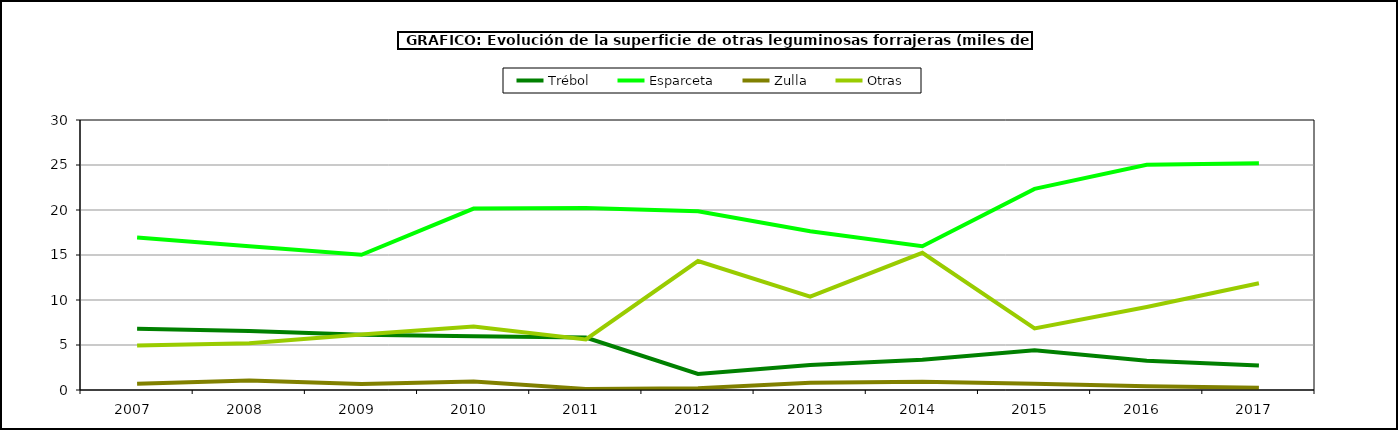
| Category | Trébol | Esparceta | Zulla | Otras |
|---|---|---|---|---|
| 2007.0 | 6.792 | 16.94 | 0.703 | 4.949 |
| 2008.0 | 6.551 | 15.979 | 1.06 | 5.192 |
| 2009.0 | 6.149 | 15.028 | 0.667 | 6.159 |
| 2010.0 | 5.977 | 20.154 | 0.957 | 7.056 |
| 2011.0 | 5.836 | 20.216 | 0.117 | 5.61 |
| 2012.0 | 1.782 | 19.86 | 0.202 | 14.331 |
| 2013.0 | 2.77 | 17.645 | 0.8 | 10.366 |
| 2014.0 | 3.361 | 15.981 | 0.92 | 15.244 |
| 2015.0 | 4.404 | 22.35 | 0.693 | 6.846 |
| 2016.0 | 3.241 | 25.025 | 0.423 | 9.224 |
| 2017.0 | 2.711 | 25.183 | 0.247 | 11.87 |